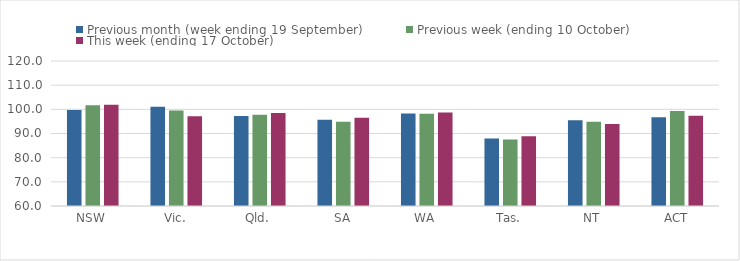
| Category | Previous month (week ending 19 September) | Previous week (ending 10 October) | This week (ending 17 October) |
|---|---|---|---|
| NSW | 99.77 | 101.69 | 101.94 |
| Vic. | 101.06 | 99.51 | 97.09 |
| Qld. | 97.29 | 97.76 | 98.51 |
| SA | 95.74 | 94.83 | 96.49 |
| WA | 98.31 | 98.2 | 98.74 |
| Tas. | 87.98 | 87.55 | 88.85 |
| NT | 95.48 | 94.91 | 93.88 |
| ACT | 96.71 | 99.34 | 97.37 |